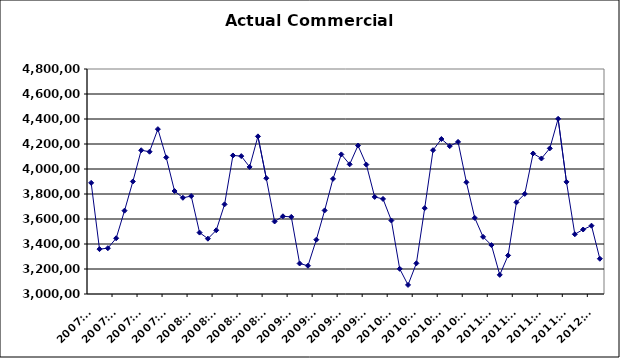
| Category | Series 0 |
|---|---|
| 2007-01-01 | 3889291.669 |
| 2007-02-01 | 3358951.981 |
| 2007-03-01 | 3366379.86 |
| 2007-04-01 | 3446103.672 |
| 2007-05-01 | 3666601.801 |
| 2007-06-01 | 3900150.548 |
| 2007-07-01 | 4149936.144 |
| 2007-08-01 | 4138312.537 |
| 2007-09-01 | 4318784.96 |
| 2007-10-01 | 4092780.028 |
| 2007-11-01 | 3823862.685 |
| 2007-12-01 | 3769685.607 |
| 2008-01-01 | 3783449.121 |
| 2008-02-01 | 3491303.985 |
| 2008-03-01 | 3442605.194 |
| 2008-04-01 | 3509770.796 |
| 2008-05-01 | 3717189.961 |
| 2008-06-01 | 4108255.094 |
| 2008-07-01 | 4103113.07 |
| 2008-08-01 | 4016555.765 |
| 2008-09-01 | 4261070.784 |
| 2008-10-01 | 3926048.316 |
| 2008-11-01 | 3580327.432 |
| 2008-12-01 | 3621740.122 |
| 2009-01-01 | 3616795.458 |
| 2009-02-01 | 3244004.159 |
| 2009-03-01 | 3225893.502 |
| 2009-04-01 | 3434498.544 |
| 2009-05-01 | 3668648.872 |
| 2009-06-01 | 3921149.599 |
| 2009-07-01 | 4116634.573 |
| 2009-08-01 | 4037452.744 |
| 2009-09-01 | 4187546.25 |
| 2009-10-01 | 4035129.782 |
| 2009-11-01 | 3776580.596 |
| 2009-12-01 | 3760378.763 |
| 2010-01-01 | 3588072.011 |
| 2010-02-01 | 3201547.929 |
| 2010-03-01 | 3072576.762 |
| 2010-04-01 | 3245212.012 |
| 2010-05-01 | 3686740.905 |
| 2010-06-01 | 4150599.814 |
| 2010-07-01 | 4239946.393 |
| 2010-08-01 | 4182914.282 |
| 2010-09-01 | 4216695.962 |
| 2010-10-01 | 3893832.596 |
| 2010-11-01 | 3608841.565 |
| 2010-12-01 | 3457175.766 |
| 2011-01-01 | 3391263.181 |
| 2011-02-01 | 3153069.658 |
| 2011-03-01 | 3308624.53 |
| 2011-04-01 | 3733380.502 |
| 2011-05-01 | 3800633.967 |
| 2011-06-01 | 4124100.254 |
| 2011-07-01 | 4084168.546 |
| 2011-08-01 | 4165023.172 |
| 2011-09-01 | 4401250.534 |
| 2011-10-01 | 3896890.937 |
| 2011-11-01 | 3478005.869 |
| 2011-12-01 | 3515879.847 |
| 2012-01-01 | 3546422.698 |
| 2012-02-01 | 3282168.583 |